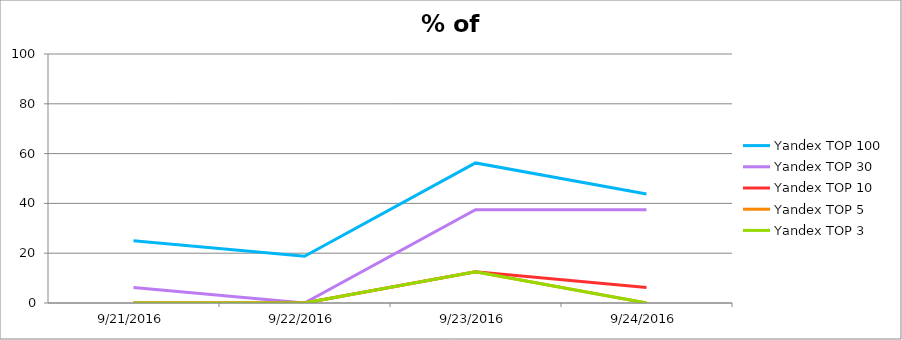
| Category | Yandex TOP 100 | Yandex TOP 30 | Yandex TOP 10 | Yandex TOP 5 | Yandex TOP 3 |
|---|---|---|---|---|---|
| 2/25/14 | 40 | 24 | 37 | 54 | 14 |
| 2/26/14 | 60 | 31 | 77 | 20 | 35 |
| 2/27/14 | 70 | 54 | 81 | 21 | 49 |
| 2/28/14 | 80 | 41 | 2 | 56 | 65 |
| 3/1/14 | 65 | 21 | 84 | 72 | 22 |